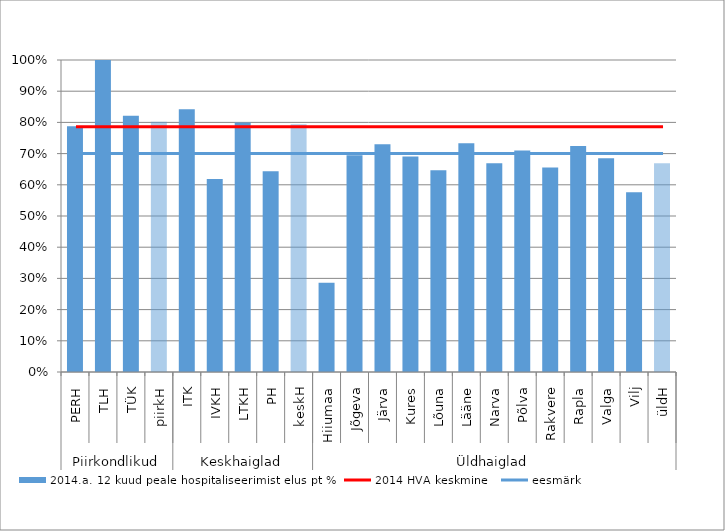
| Category | 2014.a. 12 kuud peale hospitaliseerimist elus pt % |
|---|---|
| 0 | 0.788 |
| 1 | 1 |
| 2 | 0.821 |
| 3 | 0.802 |
| 4 | 0.842 |
| 5 | 0.619 |
| 6 | 0.8 |
| 7 | 0.644 |
| 8 | 0.794 |
| 9 | 0.286 |
| 10 | 0.695 |
| 11 | 0.73 |
| 12 | 0.691 |
| 13 | 0.647 |
| 14 | 0.733 |
| 15 | 0.669 |
| 16 | 0.71 |
| 17 | 0.656 |
| 18 | 0.724 |
| 19 | 0.685 |
| 20 | 0.576 |
| 21 | 0.669 |